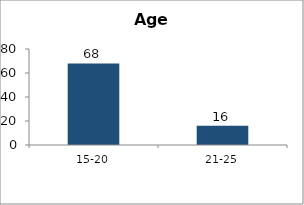
| Category | Age |
|---|---|
| 15-20 | 68 |
| 21-25 | 16 |